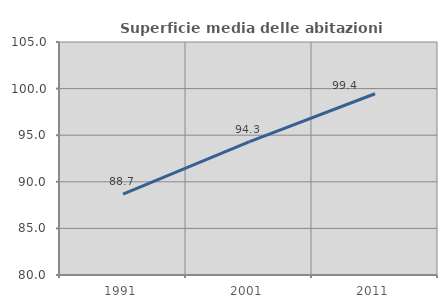
| Category | Superficie media delle abitazioni occupate |
|---|---|
| 1991.0 | 88.669 |
| 2001.0 | 94.285 |
| 2011.0 | 99.448 |